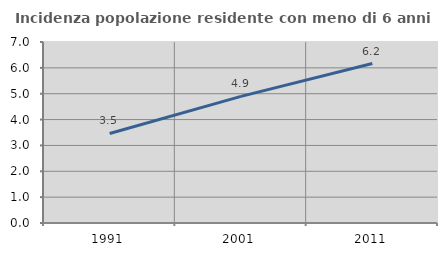
| Category | Incidenza popolazione residente con meno di 6 anni |
|---|---|
| 1991.0 | 3.463 |
| 2001.0 | 4.896 |
| 2011.0 | 6.167 |